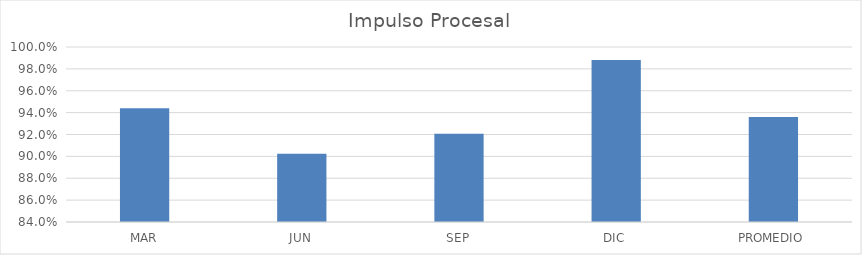
| Category | Series 0 |
|---|---|
| MAR | 0.944 |
| JUN | 0.902 |
| SEP | 0.921 |
| DIC | 0.988 |
| PROMEDIO | 0.936 |